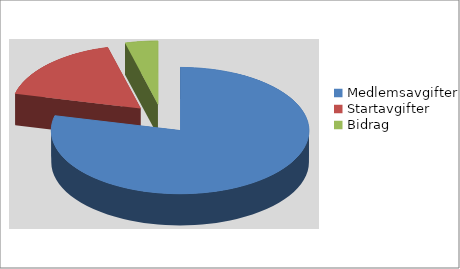
| Category | Series 0 |
|---|---|
| Medlemsavgifter | 230000 |
| Startavgifter | 50000 |
| Bidrag | 12000 |